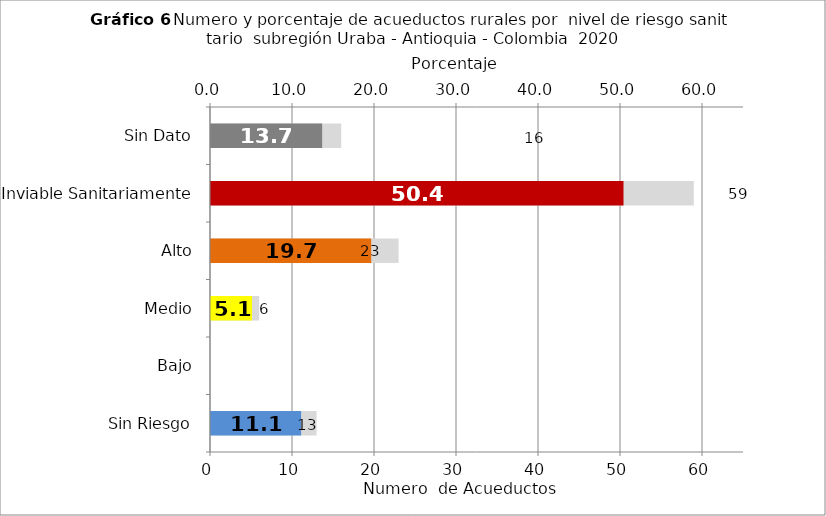
| Category | Número de Sistemas |
|---|---|
| Sin Riesgo | 13 |
| Bajo | 0 |
| Medio | 6 |
| Alto | 23 |
| Inviable Sanitariamente | 59 |
| Sin Dato | 16 |